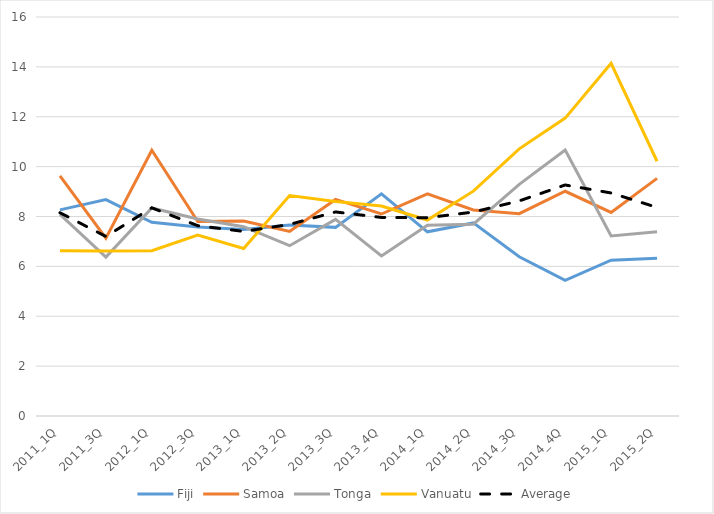
| Category | Fiji | Samoa | Tonga | Vanuatu | Average |
|---|---|---|---|---|---|
| 2011_1Q | 8.266 | 9.63 | 8.081 | 6.625 | 8.151 |
| 2011_3Q | 8.677 | 7.129 | 6.374 | 6.621 | 7.2 |
| 2012_1Q | 7.768 | 10.656 | 8.34 | 6.626 | 8.347 |
| 2012_3Q | 7.582 | 7.796 | 7.897 | 7.253 | 7.632 |
| 2013_1Q | 7.479 | 7.815 | 7.59 | 6.72 | 7.401 |
| 2013_2Q | 7.657 | 7.398 | 6.829 | 8.842 | 7.682 |
| 2013_3Q | 7.564 | 8.685 | 7.884 | 8.598 | 8.183 |
| 2013_4Q | 8.908 | 8.1 | 6.42 | 8.421 | 7.962 |
| 2014_1Q | 7.385 | 8.912 | 7.652 | 7.858 | 7.952 |
| 2014_2Q | 7.743 | 8.262 | 7.691 | 9.017 | 8.178 |
| 2014_3Q | 6.383 | 8.115 | 9.289 | 10.713 | 8.625 |
| 2014_4Q | 5.437 | 9.012 | 10.662 | 11.945 | 9.264 |
| 2015_1Q | 6.248 | 8.161 | 7.222 | 14.142 | 8.943 |
| 2015_2Q | 6.327 | 9.529 | 7.388 | 10.216 | 8.365 |